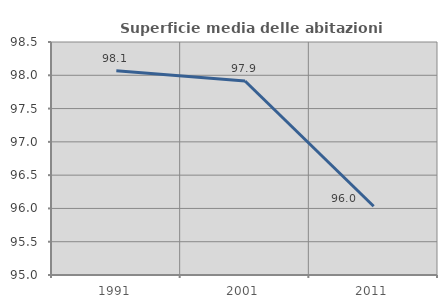
| Category | Superficie media delle abitazioni occupate |
|---|---|
| 1991.0 | 98.069 |
| 2001.0 | 97.914 |
| 2011.0 | 96.033 |